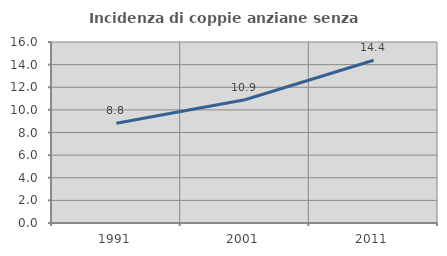
| Category | Incidenza di coppie anziane senza figli  |
|---|---|
| 1991.0 | 8.811 |
| 2001.0 | 10.893 |
| 2011.0 | 14.388 |